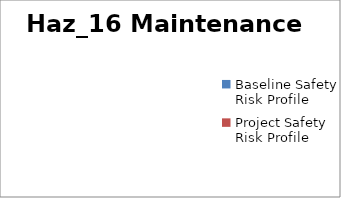
| Category | Haz_16 Maintenance |
|---|---|
| Baseline Safety Risk Profile | 0 |
| Project Safety Risk Profile | 0 |